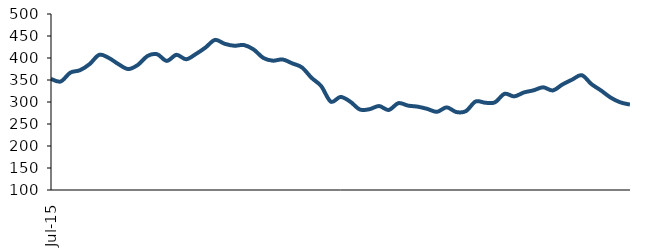
| Category | Series 0 |
|---|---|
| 2015-07-01 | 352.473 |
| 2015-08-01 | 346.564 |
| 2015-09-01 | 366.693 |
| 2015-10-01 | 372.232 |
| 2015-11-01 | 386.097 |
| 2015-12-01 | 407.237 |
| 2016-01-01 | 399.986 |
| 2016-02-01 | 385.887 |
| 2016-03-01 | 374.901 |
| 2016-04-01 | 384.272 |
| 2016-05-01 | 404.514 |
| 2016-06-01 | 408.533 |
| 2016-07-01 | 393.406 |
| 2016-08-01 | 407.207 |
| 2016-09-01 | 397.159 |
| 2016-10-01 | 408.873 |
| 2016-11-01 | 423.594 |
| 2016-12-01 | 441.096 |
| 2017-01-01 | 432.24 |
| 2017-02-01 | 427.881 |
| 2017-03-01 | 429.391 |
| 2017-04-01 | 419.316 |
| 2017-05-01 | 400.16 |
| 2017-06-01 | 393.909 |
| 2017-07-01 | 396.711 |
| 2017-08-01 | 387.782 |
| 2017-09-01 | 378.634 |
| 2017-10-01 | 354.935 |
| 2017-11-01 | 336.063 |
| 2017-12-01 | 300.729 |
| 2018-01-01 | 311.502 |
| 2018-02-01 | 300.938 |
| 2018-03-01 | 283.016 |
| 2018-04-01 | 283.614 |
| 2018-05-01 | 290.801 |
| 2018-06-01 | 281.883 |
| 2018-07-01 | 297.363 |
| 2018-08-01 | 291.807 |
| 2018-09-01 | 289.382 |
| 2018-10-01 | 284.275 |
| 2018-11-01 | 277.69 |
| 2018-12-01 | 287.83 |
| 2019-01-01 | 277.205 |
| 2019-02-01 | 279.29 |
| 2019-03-01 | 301.162 |
| 2019-04-01 | 298.325 |
| 2019-05-01 | 299.2 |
| 2019-06-01 | 318.549 |
| 2019-07-01 | 312.749 |
| 2019-08-01 | 321.636 |
| 2019-09-01 | 326.515 |
| 2019-10-01 | 333.383 |
| 2019-11-01 | 326.295 |
| 2019-12-01 | 339.824 |
| 2020-01-01 | 350.768 |
| 2020-02-01 | 360.883 |
| 2020-03-01 | 340.754 |
| 2020-04-01 | 326.108 |
| 2020-05-01 | 309.949 |
| 2020-06-01 | 299.181 |
| 2020-07-01 | 294.112 |